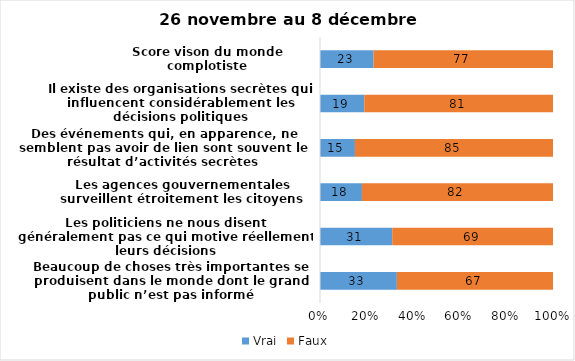
| Category | Vrai | Faux |
|---|---|---|
| Beaucoup de choses très importantes se produisent dans le monde dont le grand public n’est pas informé | 33 | 67 |
| Les politiciens ne nous disent généralement pas ce qui motive réellement leurs décisions | 31 | 69 |
| Les agences gouvernementales surveillent étroitement les citoyens | 18 | 82 |
| Des événements qui, en apparence, ne semblent pas avoir de lien sont souvent le résultat d’activités secrètes | 15 | 85 |
| Il existe des organisations secrètes qui influencent considérablement les décisions politiques | 19 | 81 |
| Score vison du monde complotiste | 23 | 77 |